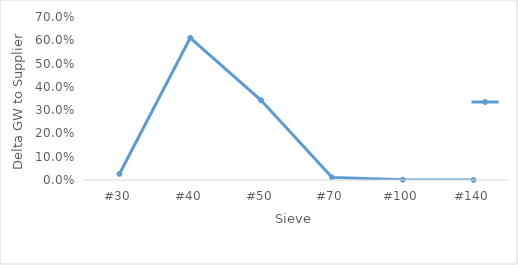
| Category | Series 0 |
|---|---|
| #30 | 0.026 |
| #40 | 0.611 |
| #50 | 0.342 |
| #70 | 0.011 |
| #100 | 0.001 |
| #140 | 0 |